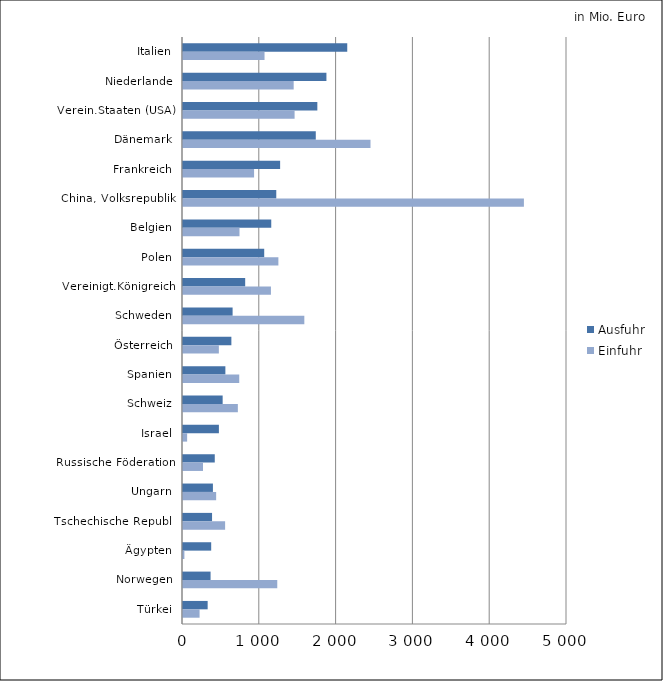
| Category | Ausfuhr | Einfuhr |
|---|---|---|
| Italien | 2138.665 | 1061.59 |
| Niederlande | 1867.489 | 1441.187 |
| Verein.Staaten (USA) | 1749.258 | 1453.062 |
| Dänemark | 1728.878 | 2441.308 |
| Frankreich | 1264.682 | 925.464 |
| China, Volksrepublik | 1214.488 | 4438.893 |
| Belgien | 1149.169 | 735.752 |
| Polen | 1057.455 | 1241.943 |
| Vereinigt.Königreich | 809.784 | 1145.085 |
| Schweden | 645.913 | 1579.786 |
| Österreich | 629.929 | 466.9 |
| Spanien | 551.739 | 732.35 |
| Schweiz | 516.341 | 714.207 |
| Israel | 467.419 | 53.875 |
| Russische Föderation | 413.641 | 260.261 |
| Ungarn | 389.585 | 431.628 |
| Tschechische Republ. | 378.27 | 548.399 |
| Ägypten | 367.102 | 18.125 |
| Norwegen | 359.103 | 1227.441 |
| Türkei | 321.037 | 215.903 |